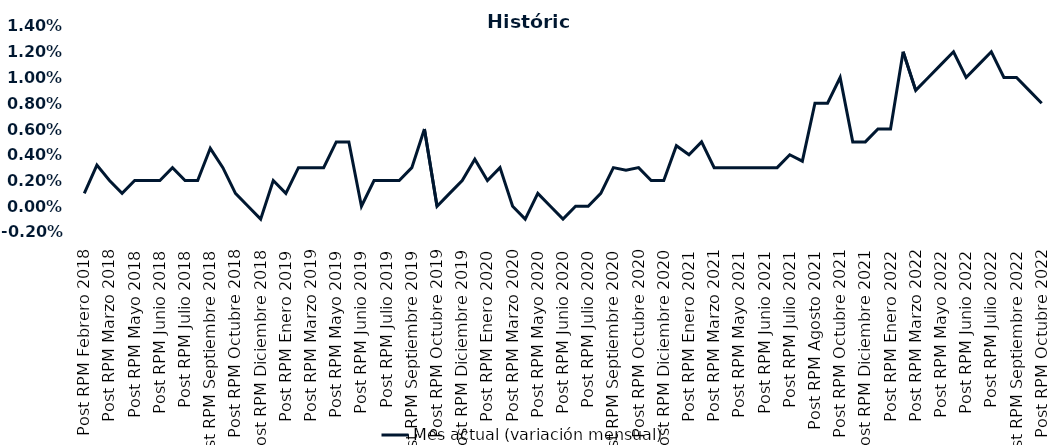
| Category | Mes actual (variación mensual)  |
|---|---|
| Post RPM Febrero 2018 | 0.001 |
| Pre RPM Marzo 2018 | 0.003 |
| Post RPM Marzo 2018 | 0.002 |
| Pre RPM Mayo 2018 | 0.001 |
| Post RPM Mayo 2018 | 0.002 |
| Pre RPM Junio 2018 | 0.002 |
| Post RPM Junio 2018 | 0.002 |
| Pre RPM Julio 2018 | 0.003 |
| Post RPM Julio 2018 | 0.002 |
| Pre RPM Septiembre 2018 | 0.002 |
| Post RPM Septiembre 2018 | 0.004 |
| Pre RPM Octubre 2018 | 0.003 |
| Post RPM Octubre 2018 | 0.001 |
| Pre RPM Diciembre 2018 | 0 |
| Post RPM Diciembre 2018 | -0.001 |
| Pre RPM Enero 2019 | 0.002 |
| Post RPM Enero 2019 | 0.001 |
| Pre RPM Marzo 2019 | 0.003 |
| Post RPM Marzo 2019 | 0.003 |
| Pre RPM Mayo 2019 | 0.003 |
| Post RPM Mayo 2019 | 0.005 |
| Pre RPM Junio 2019 | 0.005 |
| Post RPM Junio 2019 | 0 |
| Pre RPM Julio 2019 | 0.002 |
| Post RPM Julio 2019 | 0.002 |
| Pre RPM Septiembre 2019 | 0.002 |
| Post RPM Septiembre 2019 | 0.003 |
| Pre RPM Octubre 2019 | 0.006 |
| Post RPM Octubre 2019 | 0 |
| Pre RPM Diciembre 2019 | 0.001 |
| Post RPM Diciembre 2019 | 0.002 |
| Pre RPM Enero 2020 | 0.004 |
| Post RPM Enero 2020 | 0.002 |
| Pre RPM Marzo 2020 | 0.003 |
| Post RPM Marzo 2020 | 0 |
| Pre RPM Mayo 2020 | -0.001 |
| Post RPM Mayo 2020 | 0.001 |
| Pre RPM Junio 2020 | 0 |
| Post RPM Junio 2020 | -0.001 |
| Pre RPM Julio 2020 | 0 |
| Post RPM Julio 2020 | 0 |
| Pre RPM Septiembre 2020 | 0.001 |
| Post RPM Septiembre 2020 | 0.003 |
| Pre RPM Octubre 2020 | 0.003 |
| Post RPM Octubre 2020 | 0.003 |
| Pre RPM Diciembre 2020 | 0.002 |
| Post RPM Diciembre 2020 | 0.002 |
| Pre RPM Enero 2021 | 0.005 |
| Post RPM Enero 2021 | 0.004 |
| Pre RPM Marzo 2021 | 0.005 |
| Post RPM Marzo 2021 | 0.003 |
| Pre RPM Mayo 2021 | 0.003 |
| Post RPM Mayo 2021 | 0.003 |
| Pre RPM Junio 2021 | 0.003 |
| Post RPM Junio 2021 | 0.003 |
| Pre RPM Julio 2021 | 0.003 |
| Post RPM Julio 2021 | 0.004 |
| Pre RPM Agosto 2021 | 0.004 |
| Post RPM Agosto 2021 | 0.008 |
| Pre RPM Octubre 2021 | 0.008 |
| Post RPM Octubre 2021 | 0.01 |
| Pre RPM Diciembre 2021 | 0.005 |
| Post RPM Diciembre 2021 | 0.005 |
| Pre RPM Enero 2022 | 0.006 |
| Post RPM Enero 2022 | 0.006 |
| Pre RPM Marzo 2022 | 0.012 |
| Post RPM Marzo 2022 | 0.009 |
| Pre RPM Mayo 2022 | 0.01 |
| Post RPM Mayo 2022 | 0.011 |
| Pre RPM Junio 2022 | 0.012 |
| Post RPM Junio 2022 | 0.01 |
| Pre RPM Julio 2022 | 0.011 |
| Post RPM Julio 2022 | 0.012 |
| Pre RPM Septiembre 2022 | 0.01 |
| Post RPM Septiembre 2022 | 0.01 |
| Pre RPM Octubre 2022 | 0.009 |
| Post RPM Octubre 2022 | 0.008 |